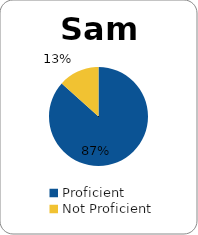
| Category | Series 0 |
|---|---|
| Proficient | 0.867 |
| Not Proficient | 0.133 |